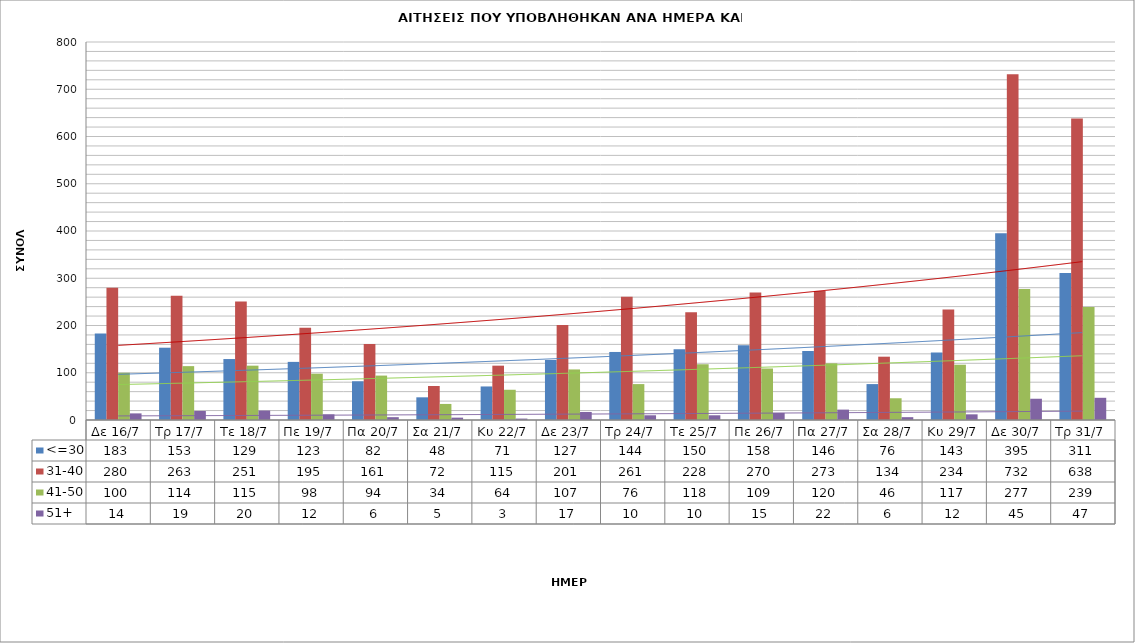
| Category | <=30 | 31-40 | 41-50 | 51+ |
|---|---|---|---|---|
| Δε 16/7 | 183 | 280 | 100 | 14 |
| Τρ 17/7 | 153 | 263 | 114 | 19 |
| Τε 18/7 | 129 | 251 | 115 | 20 |
| Πε 19/7 | 123 | 195 | 98 | 12 |
| Πα 20/7 | 82 | 161 | 94 | 6 |
| Σα 21/7 | 48 | 72 | 34 | 5 |
| Κυ 22/7 | 71 | 115 | 64 | 3 |
| Δε 23/7 | 127 | 201 | 107 | 17 |
| Τρ 24/7 | 144 | 261 | 76 | 10 |
| Τε 25/7 | 150 | 228 | 118 | 10 |
| Πε 26/7 | 158 | 270 | 109 | 15 |
| Πα 27/7 | 146 | 273 | 120 | 22 |
| Σα 28/7 | 76 | 134 | 46 | 6 |
| Κυ 29/7 | 143 | 234 | 117 | 12 |
| Δε 30/7 | 395 | 732 | 277 | 45 |
| Τρ 31/7 | 311 | 638 | 239 | 47 |